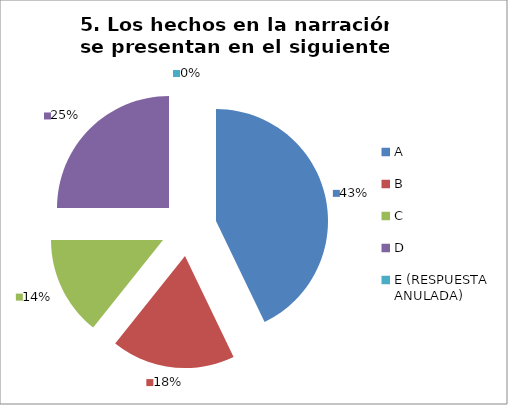
| Category | CANTIDAD DE RESPUESTAS PREGUNTA (5) | PORCENTAJE |
|---|---|---|
| A | 12 | 0.429 |
| B | 5 | 0.179 |
| C | 4 | 0.143 |
| D | 7 | 0.25 |
| E (RESPUESTA ANULADA) | 0 | 0 |